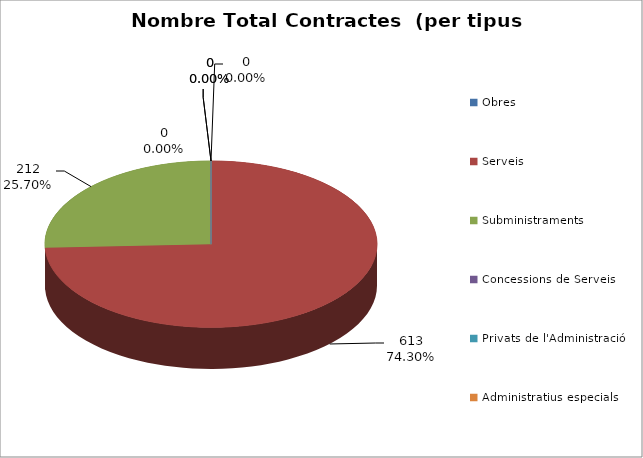
| Category | Nombre Total Contractes |
|---|---|
| Obres | 0 |
| Serveis | 613 |
| Subministraments | 212 |
| Concessions de Serveis | 0 |
| Privats de l'Administració | 0 |
| Administratius especials | 0 |